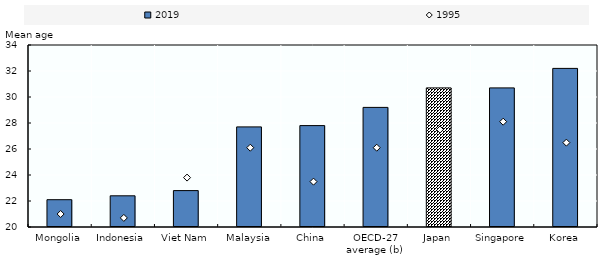
| Category | 2019 |
|---|---|
| Mongolia | 22.1 |
| Indonesia | 22.4 |
| Viet Nam | 22.8 |
| Malaysia | 27.7 |
| China | 27.8 |
| OECD-27 average (b) | 29.2 |
| Japan | 30.7 |
| Singapore | 30.7 |
| Korea | 32.2 |